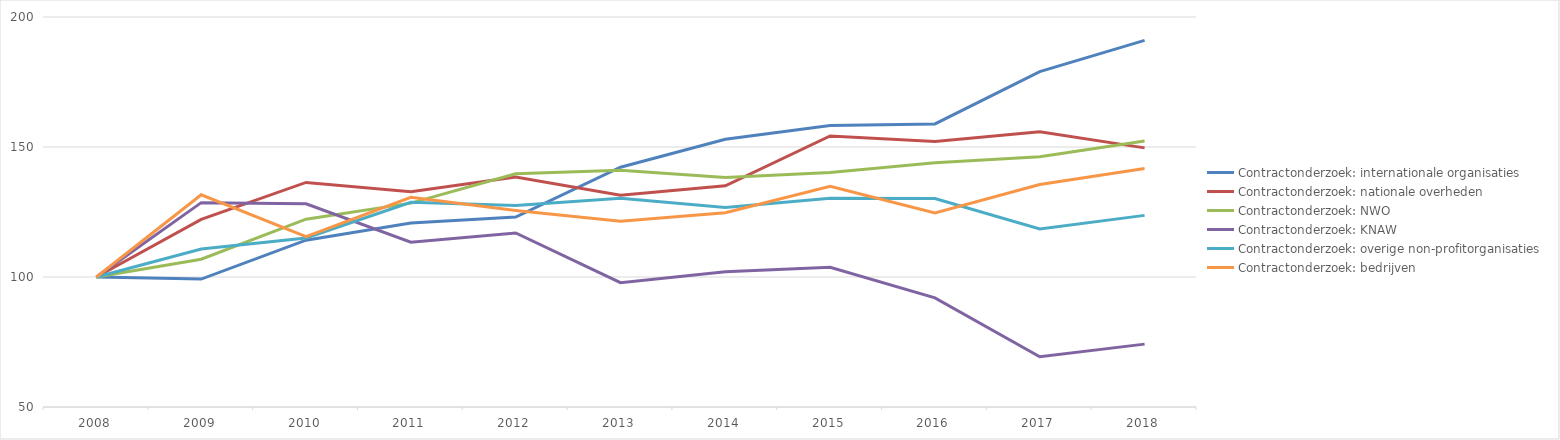
| Category | Contractonderzoek: internationale organisaties  | Contractonderzoek: nationale overheden | Contractonderzoek: NWO | Contractonderzoek: KNAW | Contractonderzoek: overige non-profitorganisaties | Contractonderzoek: bedrijven |
|---|---|---|---|---|---|---|
| 2008.0 | 100 | 100 | 100 | 100 | 100 | 100 |
| 2009.0 | 99.189 | 122.144 | 106.817 | 128.598 | 110.731 | 131.63 |
| 2010.0 | 114.149 | 136.372 | 122.232 | 128.13 | 115.008 | 115.482 |
| 2011.0 | 120.732 | 132.753 | 128.402 | 113.399 | 128.759 | 130.673 |
| 2012.0 | 123.039 | 138.484 | 139.707 | 116.942 | 127.459 | 125.593 |
| 2013.0 | 142.22 | 131.403 | 141.031 | 97.83 | 130.305 | 121.413 |
| 2014.0 | 152.96 | 135.095 | 138.266 | 102.038 | 126.706 | 124.712 |
| 2015.0 | 158.279 | 154.264 | 140.232 | 103.727 | 130.325 | 134.846 |
| 2016.0 | 158.86 | 152.108 | 143.909 | 91.981 | 130.207 | 124.638 |
| 2017.0 | 178.967 | 155.848 | 146.24 | 69.322 | 118.493 | 135.598 |
| 2018.0 | 191.019 | 149.662 | 152.304 | 74.183 | 123.704 | 141.741 |